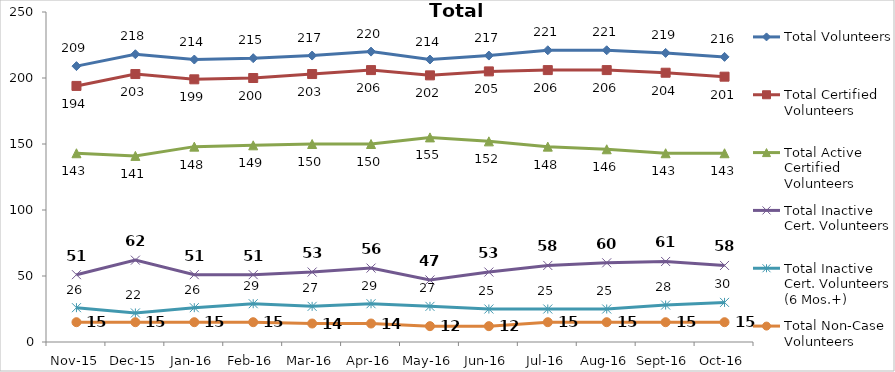
| Category | Total Volunteers | Total Certified Volunteers | Total Active Certified Volunteers | Total Inactive Cert. Volunteers | Total Inactive Cert. Volunteers (6 Mos.+) | Total Non-Case Volunteers |
|---|---|---|---|---|---|---|
| Nov-15 | 209 | 194 | 143 | 51 | 26 | 15 |
| Dec-15 | 218 | 203 | 141 | 62 | 22 | 15 |
| Jan-16 | 214 | 199 | 148 | 51 | 26 | 15 |
| Feb-16 | 215 | 200 | 149 | 51 | 29 | 15 |
| Mar-16 | 217 | 203 | 150 | 53 | 27 | 14 |
| Apr-16 | 220 | 206 | 150 | 56 | 29 | 14 |
| May-16 | 214 | 202 | 155 | 47 | 27 | 12 |
| Jun-16 | 217 | 205 | 152 | 53 | 25 | 12 |
| Jul-16 | 221 | 206 | 148 | 58 | 25 | 15 |
| Aug-16 | 221 | 206 | 146 | 60 | 25 | 15 |
| Sep-16 | 219 | 204 | 143 | 61 | 28 | 15 |
| Oct-16 | 216 | 201 | 143 | 58 | 30 | 15 |